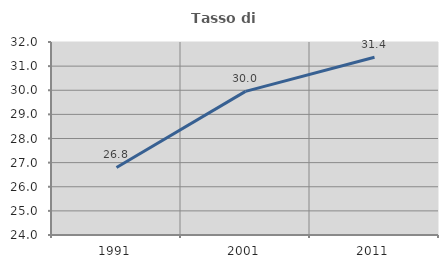
| Category | Tasso di occupazione   |
|---|---|
| 1991.0 | 26.799 |
| 2001.0 | 29.954 |
| 2011.0 | 31.367 |